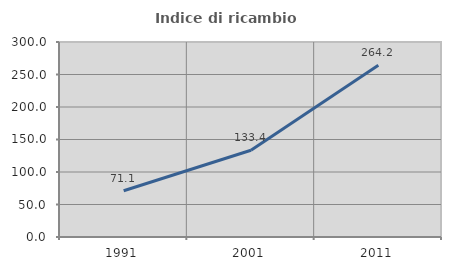
| Category | Indice di ricambio occupazionale  |
|---|---|
| 1991.0 | 71.109 |
| 2001.0 | 133.421 |
| 2011.0 | 264.186 |